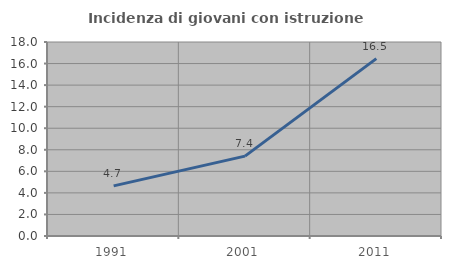
| Category | Incidenza di giovani con istruzione universitaria |
|---|---|
| 1991.0 | 4.65 |
| 2001.0 | 7.412 |
| 2011.0 | 16.46 |